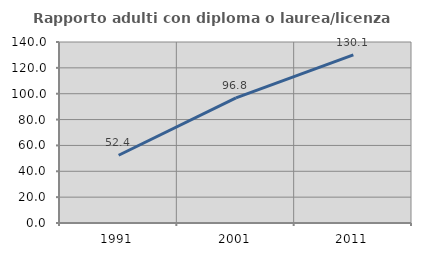
| Category | Rapporto adulti con diploma o laurea/licenza media  |
|---|---|
| 1991.0 | 52.411 |
| 2001.0 | 96.805 |
| 2011.0 | 130.087 |